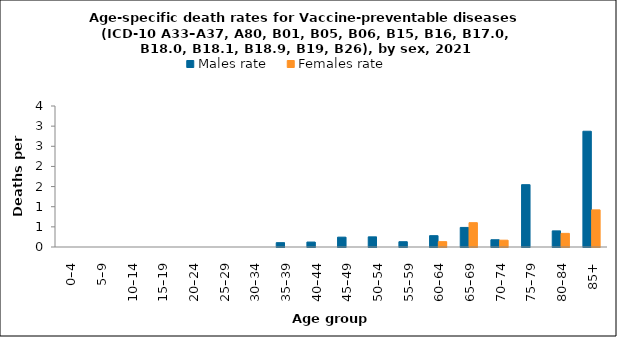
| Category | Males rate | Females rate |
|---|---|---|
| 0–4 | 0 | 0 |
| 5–9 | 0 | 0 |
| 10–14 | 0 | 0 |
| 15–19 | 0 | 0 |
| 20–24 | 0 | 0 |
| 25–29 | 0 | 0 |
| 30–34 | 0 | 0 |
| 35–39 | 0.108 | 0 |
| 40–44 | 0.123 | 0 |
| 45–49 | 0.245 | 0 |
| 50–54 | 0.252 | 0 |
| 55–59 | 0.131 | 0 |
| 60–64 | 0.281 | 0.133 |
| 65–69 | 0.486 | 0.604 |
| 70–74 | 0.18 | 0.169 |
| 75–79 | 1.547 | 0 |
| 80–84 | 0.4 | 0.338 |
| 85+ | 2.873 | 0.922 |